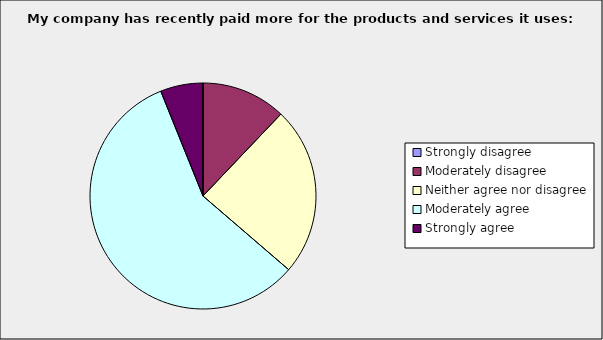
| Category | Series 0 |
|---|---|
| Strongly disagree | 0 |
| Moderately disagree | 0.121 |
| Neither agree nor disagree | 0.242 |
| Moderately agree | 0.576 |
| Strongly agree | 0.061 |